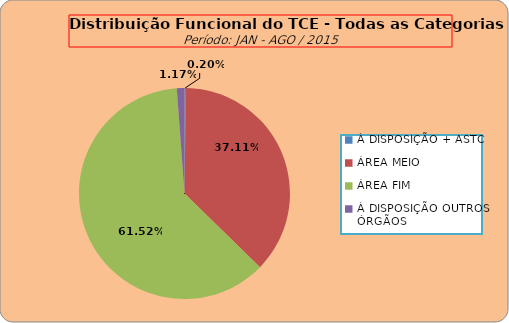
| Category | Series 0 |
|---|---|
| À DISPOSIÇÃO + ASTC | 1 |
| ÁREA MEIO | 190 |
| ÁREA FIM | 315 |
| À DISPOSIÇÃO OUTROS ÓRGÃOS | 6 |